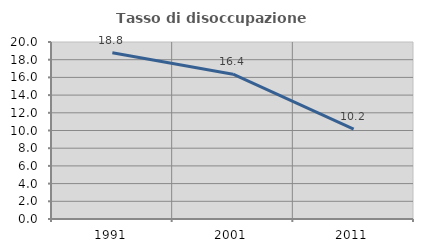
| Category | Tasso di disoccupazione giovanile  |
|---|---|
| 1991.0 | 18.785 |
| 2001.0 | 16.364 |
| 2011.0 | 10.156 |